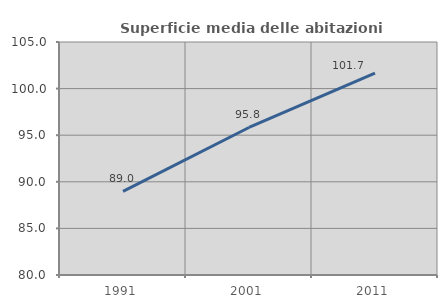
| Category | Superficie media delle abitazioni occupate |
|---|---|
| 1991.0 | 88.965 |
| 2001.0 | 95.828 |
| 2011.0 | 101.673 |